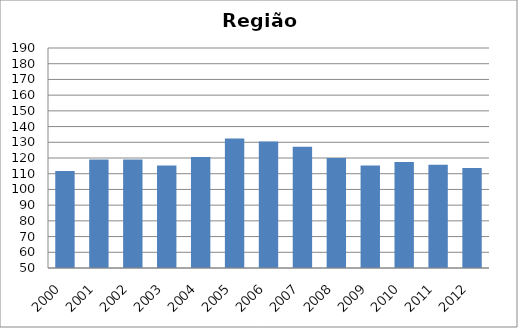
| Category | BCG |
|---|---|
| 2000.0 | 111.66 |
| 2001.0 | 119.05 |
| 2002.0 | 119.11 |
| 2003.0 | 115.16 |
| 2004.0 | 120.65 |
| 2005.0 | 132.45 |
| 2006.0 | 130.46 |
| 2007.0 | 127.23 |
| 2008.0 | 120.07 |
| 2009.0 | 115.26 |
| 2010.0 | 117.45 |
| 2011.0 | 115.7 |
| 2012.0 | 113.64 |